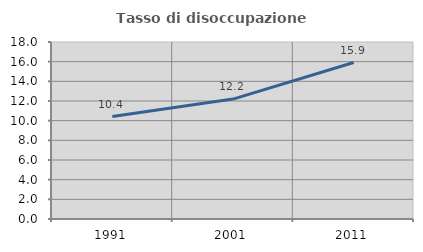
| Category | Tasso di disoccupazione giovanile  |
|---|---|
| 1991.0 | 10.417 |
| 2001.0 | 12.195 |
| 2011.0 | 15.909 |